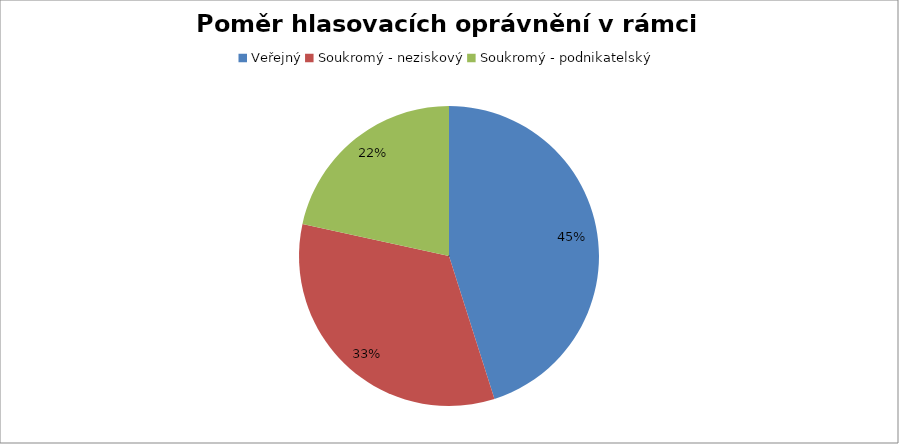
| Category | Series 0 |
|---|---|
| Veřejný | 0.451 |
| Soukromý - neziskový | 0.333 |
| Soukromý - podnikatelský | 0.216 |